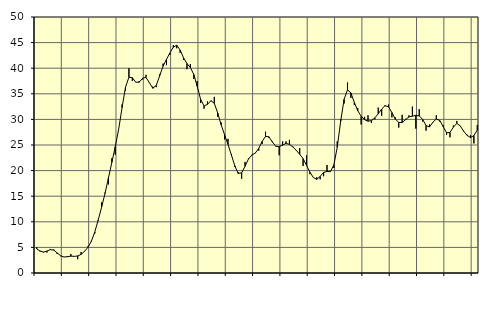
| Category | Piggar | Series 1 |
|---|---|---|
| nan | 5 | 4.7 |
| 87.0 | 4.2 | 4.3 |
| 87.0 | 4 | 4.08 |
| 87.0 | 4 | 4.28 |
| nan | 4.7 | 4.57 |
| 88.0 | 4.6 | 4.46 |
| 88.0 | 3.7 | 3.93 |
| 88.0 | 3.3 | 3.37 |
| nan | 3.1 | 3.12 |
| 89.0 | 3.1 | 3.2 |
| 89.0 | 3.7 | 3.29 |
| 89.0 | 3.2 | 3.25 |
| nan | 2.7 | 3.33 |
| 90.0 | 4.1 | 3.64 |
| 90.0 | 4.3 | 4.24 |
| 90.0 | 5.2 | 5.01 |
| nan | 6.3 | 6.19 |
| 91.0 | 7.7 | 8.01 |
| 91.0 | 10.2 | 10.33 |
| 91.0 | 13.8 | 12.85 |
| nan | 15.7 | 15.53 |
| 92.0 | 17.3 | 18.55 |
| 92.0 | 22.4 | 21.61 |
| 92.0 | 23.1 | 24.68 |
| nan | 28.1 | 28.09 |
| 93.0 | 32.9 | 32.32 |
| 93.0 | 35.6 | 36.3 |
| 93.0 | 40 | 38.25 |
| nan | 37.5 | 38.15 |
| 94.0 | 37.3 | 37.27 |
| 94.0 | 37.5 | 37.26 |
| 94.0 | 37.8 | 38.04 |
| nan | 38.7 | 38.19 |
| 95.0 | 37.1 | 37.15 |
| 95.0 | 36.4 | 36.08 |
| 95.0 | 36.3 | 36.63 |
| nan | 38.8 | 38.52 |
| 96.0 | 40.9 | 40.38 |
| 96.0 | 40.6 | 41.73 |
| 96.0 | 42.6 | 42.98 |
| nan | 44.5 | 44.12 |
| 97.0 | 43.9 | 44.49 |
| 97.0 | 43 | 43.54 |
| 97.0 | 41.6 | 42.02 |
| nan | 39.8 | 40.91 |
| 98.0 | 40.8 | 40.12 |
| 98.0 | 37.9 | 38.77 |
| 98.0 | 37.5 | 36.44 |
| nan | 33.2 | 33.9 |
| 99.0 | 32.1 | 32.62 |
| 99.0 | 33.5 | 32.94 |
| 99.0 | 33.7 | 33.64 |
| nan | 34.4 | 33.14 |
| 0.0 | 30.5 | 31.25 |
| 0.0 | 29.4 | 28.95 |
| 0.0 | 26.1 | 27.02 |
| nan | 26.2 | 25.12 |
| 1.0 | 23.2 | 23.06 |
| 1.0 | 20.7 | 20.93 |
| 1.0 | 19.7 | 19.45 |
| nan | 18.4 | 19.55 |
| 2.0 | 21.7 | 20.84 |
| 2.0 | 22.4 | 22.27 |
| 2.0 | 23.1 | 23.03 |
| nan | 23.4 | 23.43 |
| 3.0 | 23.9 | 24.34 |
| 3.0 | 25.2 | 25.69 |
| 3.0 | 27.6 | 26.68 |
| nan | 26.4 | 26.6 |
| 4.0 | 25.7 | 25.59 |
| 4.0 | 24.7 | 24.76 |
| 4.0 | 23 | 24.67 |
| nan | 25.7 | 24.97 |
| 5.0 | 25.7 | 25.3 |
| 5.0 | 26 | 25.12 |
| 5.0 | 24.7 | 24.62 |
| nan | 24 | 23.95 |
| 6.0 | 24.4 | 23.18 |
| 6.0 | 20.9 | 22.33 |
| 6.0 | 23 | 21.04 |
| nan | 19.3 | 19.68 |
| 7.0 | 18.6 | 18.64 |
| 7.0 | 18.7 | 18.29 |
| 7.0 | 18.3 | 18.86 |
| nan | 18.9 | 19.65 |
| 8.0 | 21.1 | 19.83 |
| 8.0 | 19.8 | 19.78 |
| 8.0 | 20.5 | 21.11 |
| nan | 25.7 | 24.56 |
| 9.0 | 30 | 29.63 |
| 9.0 | 33.1 | 33.91 |
| 9.0 | 37.2 | 35.79 |
| nan | 34.2 | 35.17 |
| 10.0 | 32.8 | 33.31 |
| 10.0 | 32.2 | 31.69 |
| 10.0 | 29 | 30.63 |
| nan | 30.5 | 29.94 |
| 11.0 | 30.8 | 29.65 |
| 11.0 | 29.3 | 29.76 |
| 11.0 | 30 | 30.29 |
| nan | 32.3 | 31.1 |
| 12.0 | 30.7 | 32.03 |
| 12.0 | 32.8 | 32.67 |
| 12.0 | 32.9 | 32.47 |
| nan | 30.4 | 31.34 |
| 13.0 | 30.4 | 30.04 |
| 13.0 | 28.4 | 29.42 |
| 13.0 | 30.9 | 29.37 |
| nan | 30.1 | 29.95 |
| 14.0 | 30.8 | 30.49 |
| 14.0 | 32.5 | 30.62 |
| 14.0 | 28.2 | 30.8 |
| nan | 32 | 30.69 |
| 15.0 | 29.6 | 29.99 |
| 15.0 | 27.8 | 28.8 |
| 15.0 | 29 | 28.51 |
| nan | 29.4 | 29.46 |
| 16.0 | 30.8 | 30.07 |
| 16.0 | 29.6 | 29.79 |
| 16.0 | 28.9 | 28.6 |
| nan | 27 | 27.39 |
| 17.0 | 26.5 | 27.45 |
| 17.0 | 28.8 | 28.49 |
| 17.0 | 29.7 | 29.22 |
| nan | 28.7 | 28.74 |
| 18.0 | 27.8 | 27.7 |
| 18.0 | 27 | 26.89 |
| 18.0 | 26.9 | 26.46 |
| nan | 25.3 | 26.84 |
| 19.0 | 28.9 | 27.92 |